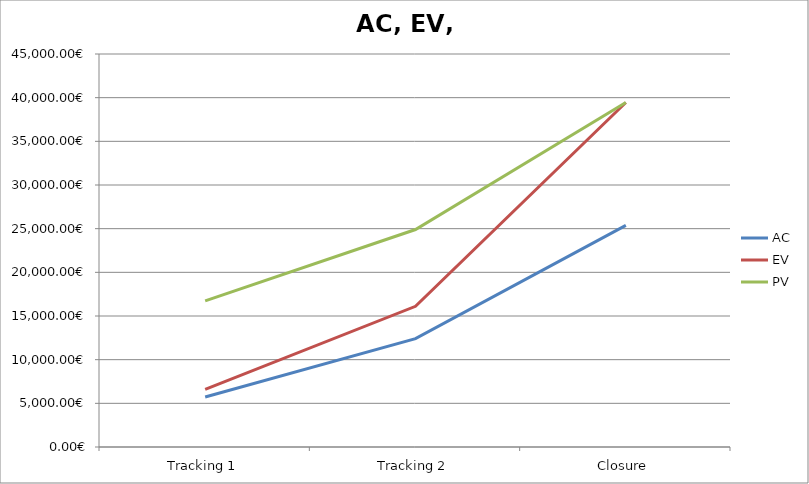
| Category | AC | EV | PV |
|---|---|---|---|
| Tracking 1 | 5730 | 6591.15 | 16725 |
| Tracking 2 | 12405 | 16109.4 | 24900 |
| Closure | 25380 | 39450 | 39450 |